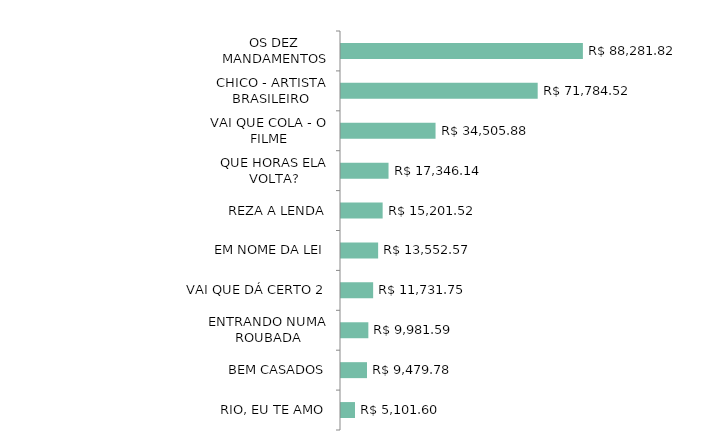
| Category | Series 0 |
|---|---|
| OS DEZ MANDAMENTOS | 88281.82 |
| CHICO - ARTISTA BRASILEIRO | 71784.52 |
| VAI QUE COLA - O FILME | 34505.88 |
| QUE HORAS ELA VOLTA? | 17346.14 |
| REZA A LENDA | 15201.52 |
| EM NOME DA LEI | 13552.57 |
| VAI QUE DÁ CERTO 2 | 11731.75 |
| ENTRANDO NUMA ROUBADA | 9981.59 |
| BEM CASADOS | 9479.78 |
| RIO, EU TE AMO | 5101.6 |